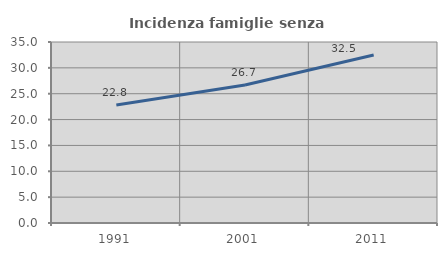
| Category | Incidenza famiglie senza nuclei |
|---|---|
| 1991.0 | 22.816 |
| 2001.0 | 26.675 |
| 2011.0 | 32.485 |